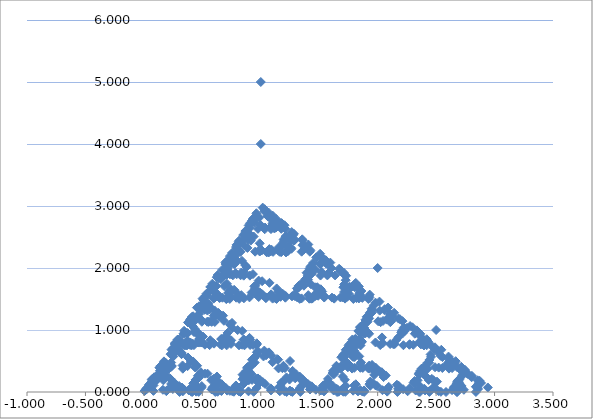
| Category | Series 0 |
|---|---|
| 1.0 | 5 |
| 1.0 | 4 |
| 2.0 | 2 |
| 2.5 | 1 |
| 1.25 | 0.5 |
| 0.625 | 0.25 |
| 1.8125 | 0.125 |
| 1.40625 | 1.562 |
| 0.703125 | 0.781 |
| 1.8515625 | 0.391 |
| 0.92578125 | 0.195 |
| 0.962890625 | 1.598 |
| 1.9814453125 | 0.799 |
| 2.49072265625 | 0.399 |
| 1.245361328125 | 0.2 |
| 0.6226806640625 | 0.1 |
| 1.81134033203125 | 0.05 |
| 2.405670166015625 | 0.025 |
| 1.2028350830078125 | 0.012 |
| 1.1014175415039062 | 1.506 |
| 1.0507087707519531 | 2.253 |
| 2.0253543853759766 | 1.127 |
| 1.5126771926879883 | 2.063 |
| 0.7563385963439941 | 1.032 |
| 0.8781692981719971 | 2.016 |
| 0.9390846490859985 | 2.508 |
| 0.46954232454299927 | 1.254 |
| 0.7347711622714996 | 2.127 |
| 0.8673855811357498 | 2.563 |
| 1.933692790567875 | 1.282 |
| 0.9668463952839375 | 0.641 |
| 1.9834231976419687 | 0.32 |
| 1.4917115988209844 | 1.66 |
| 1.2458557994104922 | 2.33 |
| 1.122927899705246 | 2.665 |
| 1.061463949852623 | 2.833 |
| 1.0307319749263115 | 2.916 |
| 2.0153659874631558 | 1.458 |
| 1.5076829937315779 | 2.229 |
| 0.7538414968657889 | 1.115 |
| 0.37692074843289447 | 0.557 |
| 0.18846037421644724 | 0.279 |
| 0.5942301871082236 | 1.639 |
| 1.7971150935541118 | 0.82 |
| 2.398557546777056 | 0.41 |
| 2.699278773388528 | 0.205 |
| 1.349639386694264 | 0.102 |
| 2.174819693347132 | 0.051 |
| 1.087409846673566 | 0.026 |
| 1.043704923336783 | 1.513 |
| 2.0218524616683915 | 0.756 |
| 1.5109262308341957 | 1.878 |
| 1.2554631154170979 | 2.439 |
| 2.127731557708549 | 1.22 |
| 1.5638657788542745 | 2.11 |
| 1.2819328894271371 | 2.555 |
| 2.140966444713569 | 1.277 |
| 1.0704832223567844 | 0.639 |
| 2.0352416111783924 | 0.319 |
| 1.0176208055891962 | 0.16 |
| 1.008810402794598 | 1.58 |
| 1.004405201397299 | 2.29 |
| 0.5022026006986495 | 1.145 |
| 0.25110130034932476 | 0.572 |
| 1.6255506501746624 | 0.286 |
| 2.312775325087331 | 0.143 |
| 2.6563876625436658 | 0.072 |
| 1.3281938312718329 | 0.036 |
| 0.6640969156359164 | 0.018 |
| 0.3320484578179582 | 0.009 |
| 1.666024228908979 | 0.004 |
| 1.3330121144544895 | 1.502 |
| 0.6665060572272448 | 0.751 |
| 0.3332530286136224 | 0.376 |
| 0.1666265143068112 | 0.188 |
| 1.5833132571534057 | 0.094 |
| 1.2916566285767028 | 1.547 |
| 2.1458283142883516 | 0.773 |
| 1.5729141571441758 | 1.887 |
| 1.286457078572088 | 2.443 |
| 0.643228539286044 | 1.222 |
| 0.321614269643022 | 0.611 |
| 0.160807134821511 | 0.305 |
| 0.5804035674107555 | 1.653 |
| 0.7902017837053777 | 2.326 |
| 1.8951008918526888 | 1.163 |
| 1.4475504459263444 | 2.082 |
| 2.223775222963172 | 1.041 |
| 2.611887611481586 | 0.52 |
| 2.8059438057407933 | 0.26 |
| 1.4029719028703966 | 0.13 |
| 0.7014859514351983 | 0.065 |
| 1.850742975717599 | 0.033 |
| 1.4253714878587995 | 1.516 |
| 1.2126857439293999 | 2.258 |
| 0.6063428719646999 | 1.129 |
| 1.80317143598235 | 0.565 |
| 0.901585717991175 | 0.282 |
| 1.9507928589955874 | 0.141 |
| 2.4753964294977937 | 0.071 |
| 2.737698214748897 | 0.035 |
| 1.8688491073744484 | 1.518 |
| 0.9344245536872242 | 0.759 |
| 1.967212276843612 | 0.379 |
| 1.483606138421806 | 1.69 |
| 1.241803069210903 | 2.345 |
| 1.1209015346054514 | 2.672 |
| 2.0604507673027257 | 1.336 |
| 1.0302253836513628 | 0.668 |
| 2.0151126918256814 | 0.334 |
| 2.5075563459128407 | 0.167 |
| 1.7537781729564204 | 1.584 |
| 0.8768890864782102 | 0.792 |
| 0.4384445432391051 | 0.396 |
| 1.7192222716195524 | 0.198 |
| 2.359611135809776 | 0.099 |
| 2.679805567904888 | 0.049 |
| 1.839902783952444 | 1.525 |
| 1.4199513919762219 | 2.262 |
| 1.209975695988111 | 2.631 |
| 0.6049878479940555 | 1.316 |
| 1.8024939239970277 | 0.658 |
| 0.9012469619985138 | 0.329 |
| 0.9506234809992569 | 1.664 |
| 0.47531174049962843 | 0.832 |
| 0.23765587024981422 | 0.416 |
| 0.11882793512490711 | 0.208 |
| 0.059413967562453554 | 0.104 |
| 0.5297069837812268 | 1.552 |
| 1.7648534918906134 | 0.776 |
| 0.8824267459453067 | 0.388 |
| 0.44121337297265334 | 0.194 |
| 0.7206066864863266 | 1.597 |
| 1.8603033432431633 | 0.799 |
| 1.4301516716215816 | 1.899 |
| 2.215075835810791 | 0.95 |
| 2.6075379179053955 | 0.475 |
| 2.8037689589526975 | 0.237 |
| 1.4018844794763488 | 0.119 |
| 1.2009422397381744 | 1.559 |
| 0.6004711198690872 | 0.78 |
| 1.8002355599345436 | 0.39 |
| 0.9001177799672718 | 0.195 |
| 0.4500588899836359 | 0.097 |
| 0.725029444991818 | 1.549 |
| 0.362514722495909 | 0.774 |
| 0.1812573612479545 | 0.387 |
| 0.5906286806239772 | 1.694 |
| 0.2953143403119886 | 0.847 |
| 1.6476571701559943 | 0.423 |
| 1.3238285850779972 | 1.712 |
| 0.6619142925389986 | 0.856 |
| 0.3309571462694993 | 0.428 |
| 0.16547857313474965 | 0.214 |
| 0.08273928656737482 | 0.107 |
| 0.5413696432836874 | 1.553 |
| 0.2706848216418437 | 0.777 |
| 0.13534241082092185 | 0.388 |
| 0.5676712054104609 | 1.694 |
| 1.7838356027052304 | 0.847 |
| 1.3919178013526152 | 1.924 |
| 1.1959589006763076 | 2.462 |
| 0.5979794503381538 | 1.231 |
| 0.798989725169077 | 2.115 |
| 0.8994948625845385 | 2.558 |
| 1.9497474312922694 | 1.279 |
| 0.9748737156461347 | 0.639 |
| 0.48743685782306734 | 0.32 |
| 0.7437184289115337 | 1.66 |
| 0.37185921445576686 | 0.83 |
| 1.6859296072278833 | 0.415 |
| 0.8429648036139417 | 0.207 |
| 0.9214824018069708 | 1.604 |
| 0.4607412009034854 | 0.802 |
| 0.2303706004517427 | 0.401 |
| 0.6151853002258714 | 1.7 |
| 1.8075926501129356 | 0.85 |
| 1.4037963250564678 | 1.925 |
| 2.201898162528234 | 0.963 |
| 1.100949081264117 | 0.481 |
| 2.0504745406320586 | 0.241 |
| 1.5252372703160293 | 1.62 |
| 1.2626186351580146 | 2.31 |
| 1.1313093175790074 | 2.655 |
| 1.0656546587895037 | 2.828 |
| 0.5328273293947519 | 1.414 |
| 0.7664136646973759 | 2.207 |
| 1.883206832348688 | 1.103 |
| 0.941603416174344 | 0.552 |
| 1.970801708087172 | 0.276 |
| 0.985400854043586 | 0.138 |
| 0.492700427021793 | 0.069 |
| 0.7463502135108965 | 1.534 |
| 0.37317510675544824 | 0.767 |
| 0.6865875533777241 | 1.884 |
| 0.8432937766888621 | 2.442 |
| 0.42164688834443104 | 1.221 |
| 1.7108234441722154 | 0.61 |
| 2.3554117220861075 | 0.305 |
| 1.1777058610430537 | 0.153 |
| 0.5888529305215269 | 0.076 |
| 0.29442646526076344 | 0.038 |
| 0.6472132326303817 | 1.519 |
| 1.8236066163151907 | 0.76 |
| 2.4118033081575954 | 0.38 |
| 1.7059016540787977 | 1.69 |
| 0.8529508270393988 | 0.845 |
| 1.9264754135196993 | 0.422 |
| 2.4632377067598497 | 0.211 |
| 1.7316188533799248 | 1.606 |
| 0.8658094266899624 | 0.803 |
| 0.9329047133449813 | 1.901 |
| 0.46645235667249063 | 0.951 |
| 0.23322617833624532 | 0.475 |
| 0.11661308916812266 | 0.238 |
| 0.5583065445840614 | 1.619 |
| 1.7791532722920307 | 0.809 |
| 0.8895766361460153 | 0.405 |
| 0.9447883180730077 | 1.702 |
| 0.47239415903650384 | 0.851 |
| 0.23619707951825192 | 0.426 |
| 0.618098539759126 | 1.713 |
| 1.809049269879563 | 0.856 |
| 0.9045246349397815 | 0.428 |
| 0.9522623174698908 | 1.714 |
| 0.4761311587349454 | 0.857 |
| 1.7380655793674726 | 0.429 |
| 1.3690327896837364 | 1.714 |
| 1.1845163948418682 | 2.357 |
| 1.092258197420934 | 2.679 |
| 0.546129098710467 | 1.339 |
| 0.2730645493552335 | 0.67 |
| 0.6365322746776167 | 1.835 |
| 0.8182661373388084 | 2.417 |
| 0.4091330686694042 | 1.209 |
| 0.7045665343347021 | 2.104 |
| 1.852283267167351 | 1.052 |
| 1.4261416335836756 | 2.026 |
| 1.2130708167918378 | 2.513 |
| 2.106535408395919 | 1.257 |
| 1.0532677041979595 | 0.628 |
| 2.0266338520989797 | 0.314 |
| 1.5133169260494899 | 1.657 |
| 1.256658463024745 | 2.329 |
| 1.1283292315123725 | 2.664 |
| 0.5641646157561863 | 1.332 |
| 0.28208230787809313 | 0.666 |
| 1.6410411539390466 | 0.333 |
| 2.3205205769695234 | 0.167 |
| 1.1602602884847617 | 0.083 |
| 0.5801301442423809 | 0.042 |
| 0.7900650721211904 | 1.521 |
| 0.3950325360605952 | 0.76 |
| 0.1975162680302976 | 0.38 |
| 0.0987581340151488 | 0.19 |
| 0.0493790670075744 | 0.095 |
| 0.0246895335037872 | 0.048 |
| 1.5123447667518937 | 0.024 |
| 2.256172383375947 | 0.012 |
| 1.6280861916879734 | 1.506 |
| 0.8140430958439867 | 0.753 |
| 0.9070215479219934 | 1.876 |
| 0.4535107739609967 | 0.938 |
| 1.7267553869804984 | 0.469 |
| 1.363377693490249 | 1.735 |
| 1.1816888467451245 | 2.367 |
| 2.0908444233725625 | 1.184 |
| 1.0454222116862812 | 0.592 |
| 0.5227111058431406 | 0.296 |
| 0.2613555529215703 | 0.148 |
| 0.6306777764607852 | 1.574 |
| 0.3153388882303926 | 0.787 |
| 1.6576694441151962 | 0.393 |
| 1.3288347220575982 | 1.697 |
| 0.6644173610287991 | 0.848 |
| 0.8322086805143996 | 1.924 |
| 1.9161043402571998 | 0.962 |
| 1.4580521701286 | 1.981 |
| 1.2290260850643 | 2.491 |
| 0.61451304253215 | 1.245 |
| 1.807256521266075 | 0.623 |
| 1.4036282606330375 | 1.811 |
| 0.7018141303165187 | 0.906 |
| 1.8509070651582593 | 0.453 |
| 2.4254535325791298 | 0.226 |
| 1.7127267662895649 | 1.613 |
| 2.3563633831447826 | 0.807 |
| 2.6781816915723913 | 0.403 |
| 1.8390908457861956 | 1.702 |
| 2.4195454228930977 | 0.851 |
| 1.7097727114465489 | 1.925 |
| 1.3548863557232744 | 2.463 |
| 0.6774431778616372 | 1.231 |
| 0.8387215889308186 | 2.116 |
| 0.4193607944654093 | 1.058 |
| 1.7096803972327046 | 0.529 |
| 1.3548401986163523 | 1.764 |
| 2.177420099308176 | 0.882 |
| 2.588710049654088 | 0.441 |
| 1.294355024827044 | 0.221 |
| 1.147177512413522 | 1.61 |
| 1.073588756206761 | 2.305 |
| 1.0367943781033806 | 2.653 |
| 0.5183971890516903 | 1.326 |
| 1.759198594525845 | 0.663 |
| 2.3795992972629225 | 0.332 |
| 1.1897996486314613 | 0.166 |
| 2.0948998243157306 | 0.083 |
| 1.5474499121578653 | 1.541 |
| 2.2737249560789325 | 0.771 |
| 2.6368624780394665 | 0.385 |
| 1.8184312390197332 | 1.693 |
| 0.9092156195098666 | 0.846 |
| 0.4546078097549333 | 0.423 |
| 0.22730390487746666 | 0.212 |
| 0.6136519524387334 | 1.606 |
| 1.8068259762193666 | 0.803 |
| 0.9034129881096833 | 0.401 |
| 0.45170649405484165 | 0.201 |
| 1.7258532470274208 | 0.1 |
| 2.3629266235137103 | 0.05 |
| 1.6814633117568552 | 1.525 |
| 0.8407316558784276 | 0.763 |
| 1.9203658279392137 | 0.381 |
| 0.9601829139696069 | 0.191 |
| 0.9800914569848034 | 1.595 |
| 0.4900457284924017 | 0.798 |
| 1.745022864246201 | 0.399 |
| 0.8725114321231004 | 0.199 |
| 1.9362557160615501 | 0.1 |
| 1.468127858030775 | 1.55 |
| 1.2340639290153876 | 2.275 |
| 1.1170319645076938 | 2.637 |
| 2.058515982253847 | 1.319 |
| 1.5292579911269235 | 2.159 |
| 1.2646289955634618 | 2.58 |
| 1.132314497781731 | 2.79 |
| 1.0661572488908655 | 2.895 |
| 1.0330786244454329 | 2.947 |
| 1.0165393122227164 | 2.974 |
| 0.5082696561113582 | 1.487 |
| 0.7541348280556791 | 2.243 |
| 0.37706741402783955 | 1.122 |
| 1.6885337070139197 | 0.561 |
| 0.8442668535069598 | 0.28 |
| 0.4221334267534799 | 0.14 |
| 1.7110667133767399 | 0.07 |
| 2.35553335668837 | 0.035 |
| 2.677766678344185 | 0.018 |
| 1.8388833391720925 | 1.509 |
| 2.419441669586046 | 0.754 |
| 2.709720834793023 | 0.377 |
| 2.8548604173965115 | 0.189 |
| 1.4274302086982558 | 0.094 |
| 1.2137151043491279 | 1.547 |
| 2.106857552174564 | 0.774 |
| 2.553428776087282 | 0.387 |
| 1.776714388043641 | 1.693 |
| 2.3883571940218205 | 0.847 |
| 1.1941785970109102 | 0.423 |
| 0.5970892985054551 | 0.212 |
| 1.7985446492527275 | 0.106 |
| 2.399272324626364 | 0.053 |
| 1.699636162313182 | 1.526 |
| 1.349818081156591 | 2.263 |
| 1.1749090405782954 | 2.632 |
| 1.0874545202891477 | 2.816 |
| 0.5437272601445738 | 1.408 |
| 0.2718636300722869 | 0.704 |
| 1.6359318150361435 | 0.352 |
| 1.3179659075180719 | 1.676 |
| 2.158982953759036 | 0.838 |
| 1.579491476879518 | 1.919 |
| 1.289745738439759 | 2.459 |
| 0.6448728692198795 | 1.23 |
| 0.32243643460993976 | 0.615 |
| 0.16121821730496988 | 0.307 |
| 1.580609108652485 | 0.154 |
| 0.7903045543262425 | 0.077 |
| 0.39515227716312123 | 0.038 |
| 1.6975761385815606 | 0.019 |
| 1.3487880692907803 | 1.51 |
| 1.17439403464539 | 2.255 |
| 1.087197017322695 | 2.627 |
| 0.5435985086613475 | 1.314 |
| 1.7717992543306738 | 0.657 |
| 1.3858996271653368 | 1.828 |
| 1.1929498135826684 | 2.414 |
| 2.096474906791334 | 1.207 |
| 1.548237453395667 | 2.104 |
| 1.2741187266978335 | 2.552 |
| 0.6370593633489168 | 1.276 |
| 0.3185296816744584 | 0.638 |
| 0.6592648408372292 | 1.819 |
| 0.8296324204186146 | 2.409 |
| 0.4148162102093073 | 1.205 |
| 1.7074081051046537 | 0.602 |
| 2.353704052552327 | 0.301 |
| 1.1768520262761635 | 0.151 |
| 1.0884260131380818 | 1.575 |
| 2.044213006569041 | 0.788 |
| 2.5221065032845207 | 0.394 |
| 1.7610532516422603 | 1.697 |
| 1.3805266258211302 | 2.348 |
| 2.190263312910565 | 1.174 |
| 1.5951316564552824 | 2.087 |
| 2.297565828227641 | 1.044 |
| 1.1487829141138206 | 0.522 |
| 1.0743914570569104 | 1.761 |
| 2.037195728528455 | 0.88 |
| 1.5185978642642275 | 1.94 |
| 1.2592989321321137 | 2.47 |
| 1.129649466066057 | 2.735 |
| 0.5648247330330285 | 1.368 |
| 0.28241236651651425 | 0.684 |
| 0.14120618325825712 | 0.342 |
| 0.07060309162912856 | 0.171 |
| 0.5353015458145642 | 1.585 |
| 0.2676507729072821 | 0.793 |
| 0.13382538645364106 | 0.396 |
| 0.06691269322682053 | 0.198 |
| 1.5334563466134103 | 0.099 |
| 0.7667281733067052 | 0.05 |
| 1.8833640866533525 | 0.025 |
| 2.441682043326676 | 0.012 |
| 1.720841021663338 | 1.506 |
| 0.860420510831669 | 0.753 |
| 1.9302102554158345 | 0.377 |
| 1.4651051277079172 | 1.688 |
| 1.2325525638539587 | 2.344 |
| 1.1162762819269794 | 2.672 |
| 1.0581381409634898 | 2.836 |
| 0.5290690704817449 | 1.418 |
| 0.26453453524087245 | 0.709 |
| 1.6322672676204362 | 0.355 |
| 2.3161336338102183 | 0.177 |
| 2.658066816905109 | 0.089 |
| 1.8290334084525546 | 1.544 |
| 2.414516704226277 | 0.772 |
| 1.2072583521131386 | 0.386 |
| 0.6036291760565693 | 0.193 |
| 0.30181458802828465 | 0.097 |
| 1.6509072940141423 | 0.048 |
| 2.325453647007071 | 0.024 |
| 1.1627268235035355 | 0.012 |
| 2.081363411751768 | 0.006 |
| 2.540681705875884 | 0.003 |
| 1.270340852937942 | 0.002 |
| 1.135170426468971 | 1.501 |
| 1.0675852132344854 | 2.25 |
| 1.0337926066172427 | 2.625 |
| 2.0168963033086214 | 1.313 |
| 2.508448151654311 | 0.656 |
| 2.7542240758271554 | 0.328 |
| 1.3771120379135777 | 0.164 |
| 0.6885560189567889 | 0.082 |
| 0.34427800947839443 | 0.041 |
| 0.6721390047391972 | 1.521 |
| 0.3360695023695986 | 0.76 |
| 0.1680347511847993 | 0.38 |
| 0.5840173755923996 | 1.69 |
| 0.7920086877961998 | 2.345 |
| 0.3960043438980999 | 1.173 |
| 0.6980021719490499 | 2.086 |
| 1.849001085974525 | 1.043 |
| 0.9245005429872625 | 0.522 |
| 0.46225027149363124 | 0.261 |
| 0.7311251357468156 | 1.63 |
| 1.8655625678734078 | 0.815 |
| 1.4327812839367038 | 1.908 |
| 0.7163906419683519 | 0.954 |
| 1.858195320984176 | 0.477 |
| 1.429097660492088 | 1.738 |
| 0.714548830246044 | 0.869 |
| 0.857274415123022 | 1.935 |
| 0.428637207561511 | 0.967 |
| 0.7143186037807555 | 1.984 |
| 1.8571593018903778 | 0.992 |
| 1.428579650945189 | 1.996 |
| 1.2142898254725945 | 2.498 |
| 1.1071449127362971 | 2.749 |
| 0.5535724563681486 | 1.374 |
| 0.7767862281840743 | 2.187 |
| 1.8883931140920371 | 1.094 |
| 0.9441965570460186 | 0.547 |
| 0.4720982785230093 | 0.273 |
| 0.23604913926150464 | 0.137 |
| 0.6180245696307524 | 1.568 |
| 0.8090122848153762 | 2.284 |
| 0.9045061424076881 | 2.642 |
| 1.952253071203844 | 1.321 |
| 0.976126535601922 | 0.661 |
| 1.9880632678009609 | 0.33 |
| 1.4940316339004804 | 1.665 |
| 0.7470158169502402 | 0.833 |
| 0.3735079084751201 | 0.416 |
| 0.68675395423756 | 1.708 |
| 1.84337697711878 | 0.854 |
| 0.92168848855939 | 0.427 |
| 0.460844244279695 | 0.214 |
| 0.7304221221398475 | 1.607 |
| 0.36521106106992374 | 0.803 |
| 0.18260553053496187 | 0.402 |
| 0.09130276526748093 | 0.201 |
| 0.04565138263374047 | 0.1 |
| 0.022825691316870234 | 0.05 |
| 1.511412845658435 | 0.025 |
| 0.7557064228292175 | 0.013 |
| 1.8778532114146087 | 0.006 |
| 0.9389266057073044 | 0.003 |
| 0.4694633028536522 | 0.002 |
| 0.7347316514268261 | 1.501 |
| 0.36736582571341303 | 0.75 |
| 1.6836829128567066 | 0.375 |
| 2.3418414564283534 | 0.188 |
| 1.1709207282141767 | 0.094 |
| 2.0854603641070883 | 0.047 |
| 1.5427301820535442 | 1.523 |
| 2.271365091026772 | 0.762 |
| 1.635682545513386 | 1.881 |
| 2.3178412727566933 | 0.94 |
| 2.6589206363783466 | 0.47 |
| 1.3294603181891733 | 0.235 |
| 2.164730159094587 | 0.118 |
| 1.0823650795472934 | 0.059 |
| 2.0411825397736467 | 0.029 |
| 2.5205912698868236 | 0.015 |
| 1.2602956349434118 | 0.007 |
| 0.6301478174717059 | 0.004 |
| 0.815073908735853 | 1.502 |
| 0.4075369543679265 | 0.751 |
| 0.20376847718396324 | 0.375 |
| 0.6018842385919816 | 1.688 |
| 0.3009421192959908 | 0.844 |
| 0.1504710596479954 | 0.422 |
| 1.5752355298239977 | 0.211 |
| 0.7876177649119989 | 0.105 |
| 0.39380888245599943 | 0.053 |
| 0.19690444122799972 | 0.026 |
| 0.5984522206139998 | 1.513 |
| 0.2992261103069999 | 0.757 |
| 0.14961305515349996 | 0.378 |
| 0.57480652757675 | 1.689 |
| 0.287403263788375 | 0.845 |
| 0.1437016318941875 | 0.422 |
| 0.07185081594709375 | 0.211 |
| 1.535925407973547 | 0.106 |
| 0.7679627039867735 | 0.053 |
| 0.38398135199338673 | 0.026 |
| 0.19199067599669337 | 0.013 |
| 0.5959953379983467 | 1.507 |
| 0.7979976689991733 | 2.253 |
| 0.3989988344995867 | 1.127 |
| 0.6994994172497934 | 2.063 |
| 0.8497497086248966 | 2.532 |
| 0.9248748543124483 | 2.766 |
| 0.9624374271562242 | 2.883 |
| 1.981218713578112 | 1.441 |
| 2.490609356789056 | 0.721 |
| 2.745304678394528 | 0.36 |
| 2.872652339197264 | 0.18 |
| 1.436326169598632 | 0.09 |
| 2.218163084799316 | 0.045 |
| 1.609081542399658 | 1.523 |
| 2.304540771199829 | 0.761 |
| 1.1522703855999146 | 0.381 |
| 0.5761351927999573 | 0.19 |
| 0.28806759639997864 | 0.095 |
| 1.6440337981999893 | 0.048 |
| 1.3220168990999945 | 1.524 |
| 1.1610084495499973 | 2.262 |
| 0.5805042247749986 | 1.131 |
| 1.7902521123874993 | 0.565 |
| 2.3951260561937495 | 0.283 |
| 2.6975630280968748 | 0.141 |
| 1.8487815140484374 | 1.571 |
| 1.4243907570242187 | 2.285 |
| 2.212195378512109 | 1.143 |
| 2.6060976892560546 | 0.571 |
| 1.3030488446280273 | 0.286 |
| 0.6515244223140136 | 0.143 |
| 0.3257622111570068 | 0.071 |
| 0.1628811055785034 | 0.036 |
| 0.0814405527892517 | 0.018 |
| 1.540720276394626 | 0.009 |
| 0.770360138197313 | 0.004 |
| 1.8851800690986564 | 0.002 |
| 2.4425900345493283 | 0.001 |
| 1.2212950172746642 | 0.001 |
| 0.6106475086373321 | 0 |
| 0.30532375431866604 | 0 |
| 1.652661877159333 | 0 |
| 0.8263309385796666 | 0 |
| 0.4131654692898333 | 0 |
| 0.7065827346449166 | 1.5 |
| 1.8532913673224582 | 0.75 |
| 2.426645683661229 | 0.375 |
| 1.7133228418306146 | 1.688 |
| 0.8566614209153073 | 0.844 |
| 1.9283307104576537 | 0.422 |
| 0.9641653552288268 | 0.211 |
| 1.9820826776144134 | 0.105 |
| 1.4910413388072068 | 1.553 |
| 0.7455206694036034 | 0.776 |
| 1.8727603347018018 | 0.388 |
| 2.436380167350901 | 0.194 |
| 2.7181900836754505 | 0.097 |
| 2.8590950418377252 | 0.049 |
| 1.9295475209188626 | 1.524 |
| 0.9647737604594313 | 0.762 |
| 1.9823868802297158 | 0.381 |
| 0.9911934401148579 | 0.191 |
| 1.995596720057429 | 0.095 |
| 2.4977983600287144 | 0.048 |
| 1.2488991800143572 | 0.024 |
| 1.1244495900071785 | 1.512 |
| 0.5622247950035892 | 0.756 |
| 1.7811123975017946 | 0.378 |
| 0.8905561987508973 | 0.189 |
| 0.9452780993754486 | 1.594 |
| 0.4726390496877243 | 0.797 |
| 0.7363195248438621 | 1.899 |
| 0.36815976242193105 | 0.949 |
| 0.18407988121096552 | 0.475 |
| 0.09203994060548276 | 0.237 |
| 1.5460199703027413 | 0.119 |
| 2.2730099851513708 | 0.059 |
| 2.636504992575685 | 0.03 |
| 1.8182524962878426 | 1.515 |
| 0.9091262481439213 | 0.757 |
| 1.9545631240719605 | 0.379 |
| 2.47728156203598 | 0.189 |
| 1.73864078101799 | 1.595 |
| 1.369320390508995 | 2.297 |
| 0.6846601952544975 | 1.149 |
| 1.8423300976272488 | 0.574 |
| 0.9211650488136244 | 0.287 |
| 1.9605825244068122 | 0.144 |
| 2.480291262203406 | 0.072 |
| 1.740145631101703 | 1.536 |
| 2.3700728155508513 | 0.768 |
| 1.1850364077754256 | 0.384 |
| 0.5925182038877128 | 0.192 |
| 0.7962591019438564 | 1.596 |
| 0.3981295509719282 | 0.798 |
| 0.6990647754859641 | 1.899 |
| 0.34953238774298206 | 0.949 |
| 0.17476619387149103 | 0.475 |
| 0.08738309693574552 | 0.237 |
| 0.04369154846787276 | 0.119 |
| 0.02184577423393638 | 0.059 |
| 0.01092288711696819 | 0.03 |
| 0.005461443558484095 | 0.015 |
| 0.502730721779242 | 1.507 |
| 1.7513653608896211 | 0.754 |
| 2.3756826804448106 | 0.377 |
| 2.6878413402224055 | 0.188 |
| 1.8439206701112028 | 1.594 |
| 2.4219603350556014 | 0.797 |
| 1.7109801675278007 | 1.899 |
| 1.3554900837639003 | 2.449 |
| 1.1777450418819502 | 2.725 |
| 2.088872520940975 | 1.362 |
| 2.5444362604704875 | 0.681 |
| 1.2722181302352438 | 0.341 |
| 1.1361090651176218 | 1.67 |
| 0.5680545325588109 | 0.835 |
| 0.7840272662794054 | 1.918 |
| 0.8920136331397027 | 2.459 |
| 0.9460068165698514 | 2.729 |
| 0.4730034082849257 | 1.365 |
| 0.23650170414246285 | 0.682 |
| 1.6182508520712315 | 0.341 |
| 1.3091254260356158 | 1.671 |
| 1.1545627130178078 | 2.335 |
| 2.077281356508904 | 1.168 |
| 2.5386406782544517 | 0.584 |
| 2.769320339127226 | 0.292 |
| 2.884660169563613 | 0.146 |
| 2.9423300847818066 | 0.073 |
| 1.4711650423909033 | 0.036 |
| 0.7355825211954516 | 0.018 |
| 1.8677912605977258 | 0.009 |
| 1.433895630298863 | 1.505 |
| 1.2169478151494315 | 2.252 |
| 2.108473907574716 | 1.126 |
| 2.554236953787358 | 0.563 |
| 1.277118476893679 | 0.282 |
| 0.6385592384468395 | 0.141 |
| 0.31927961922341974 | 0.07 |
| 1.65963980961171 | 0.035 |
| 0.829819904805855 | 0.018 |
| 0.4149099524029275 | 0.009 |
| 1.7074549762014637 | 0.004 |
| 2.353727488100732 | 0.002 |
| 2.676863744050366 | 0.001 |
| 1.338431872025183 | 0.001 |
| 2.1692159360125913 | 0 |
| 2.5846079680062957 | 0 |
| 1.7923039840031478 | 1.5 |
| 2.396151992001574 | 0.75 |
| 2.698075996000787 | 0.375 |
| 1.3490379980003935 | 0.188 |
| 1.1745189990001967 | 1.594 |
| 0.5872594995000984 | 0.797 |
| 0.7936297497500492 | 1.898 |
| 1.8968148748750246 | 0.949 |
| 0.9484074374375123 | 0.475 |
| 0.47420371871875616 | 0.237 |
| 0.23710185935937808 | 0.119 |
| 1.618550929679689 | 0.059 |
| 1.3092754648398444 | 1.53 |
| 0.6546377324199222 | 0.765 |
| 0.8273188662099611 | 1.882 |
| 0.9136594331049805 | 2.441 |
| 0.4568297165524903 | 1.221 |
| 0.22841485827624514 | 0.61 |
| 1.6142074291381225 | 0.305 |
| 2.3071037145690614 | 0.153 |
| 2.6535518572845307 | 0.076 |
| 1.3267759286422653 | 0.038 |
| 0.6633879643211327 | 0.019 |
| 1.8316939821605662 | 0.01 |
| 1.4158469910802831 | 1.505 |
| 0.7079234955401416 | 0.752 |
| 0.8539617477700707 | 1.876 |
| 1.9269808738850354 | 0.938 |
| 1.4634904369425177 | 1.969 |
| 2.231745218471259 | 0.985 |
| 2.6158726092356295 | 0.492 |
| 1.8079363046178147 | 1.746 |
| 0.9039681523089074 | 0.873 |
| 1.9519840761544538 | 0.437 |
| 0.9759920380772269 | 0.218 |
| 0.9879960190386134 | 1.609 |
| 0.9939980095193067 | 2.305 |
| 0.49699900475965336 | 1.152 |
| 0.24849950237982668 | 0.576 |
| 0.12424975118991334 | 0.288 |
| 0.06212487559495667 | 0.144 |
| 1.5310624377974784 | 0.072 |
| 0.7655312188987392 | 0.036 |
| 1.8827656094493697 | 0.018 |
| 1.4413828047246848 | 1.509 |
| 2.2206914023623425 | 0.755 |
| 2.6103457011811715 | 0.377 |
| 1.8051728505905857 | 1.689 |
| 0.9025864252952929 | 0.844 |
| 0.45129321264764644 | 0.422 |
| 0.22564660632382322 | 0.211 |
| 1.6128233031619117 | 0.106 |
| 0.8064116515809558 | 0.053 |
| 0.9032058257904779 | 1.526 |
| 0.951602912895239 | 2.263 |
| 0.9758014564476195 | 2.632 |
| 0.9879007282238097 | 2.816 |
| 0.49395036411190485 | 1.408 |
| 0.24697518205595242 | 0.704 |
| 0.6234875910279762 | 1.852 |
| 0.8117437955139881 | 2.426 |
| 1.905871897756994 | 1.213 |
| 2.4529359488784968 | 0.606 |
| 1.7264679744392484 | 1.803 |
| 2.3632339872196244 | 0.902 |
| 1.6816169936098122 | 1.951 |
| 2.340808496804906 | 0.975 |
| 1.670404248402453 | 1.988 |
| 2.3352021242012264 | 0.994 |
| 2.667601062100613 | 0.497 |
| 1.3338005310503065 | 0.248 |
| 0.6669002655251532 | 0.124 |
| 0.8334501327625766 | 1.562 |
| 0.4167250663812883 | 0.781 |
| 0.7083625331906441 | 1.891 |
| 1.8541812665953221 | 0.945 |
| 2.427090633297661 | 0.473 |
| 1.7135453166488306 | 1.736 |
| 1.3567726583244153 | 2.368 |
| 2.1783863291622074 | 1.184 |
| 1.0891931645811037 | 0.592 |
| 0.5445965822905519 | 0.296 |
| 0.7722982911452759 | 1.648 |
| 0.886149145572638 | 2.324 |
| 0.443074572786319 | 1.162 |
| 1.7215372863931595 | 0.581 |
| 2.3607686431965798 | 0.291 |
| 1.1803843215982899 | 0.145 |
| 0.5901921607991449 | 0.073 |
| 0.29509608039957247 | 0.036 |
| 0.6475480401997862 | 1.518 |
| 0.8237740200998931 | 2.259 |
| 0.41188701004994654 | 1.13 |
| 1.7059435050249734 | 0.565 |
| 2.3529717525124867 | 0.282 |
| 2.676485876256243 | 0.141 |
| 1.3382429381281216 | 0.071 |
| 1.1691214690640608 | 1.535 |
| 1.0845607345320305 | 2.268 |
| 0.5422803672660153 | 1.134 |
| 0.7711401836330076 | 2.067 |
| 1.8855700918165037 | 1.033 |
| 2.442785045908252 | 0.517 |
| 2.721392522954126 | 0.258 |
| 1.860696261477063 | 1.629 |
| 2.4303481307385315 | 0.815 |
| 2.7151740653692658 | 0.407 |
| 1.3575870326846329 | 0.204 |
| 2.178793516342316 | 0.102 |
| 1.089396758171158 | 0.051 |
| 1.044698379085579 | 1.525 |
| 0.5223491895427895 | 0.763 |
| 0.7611745947713948 | 1.881 |
| 1.8805872973856974 | 0.941 |
| 2.440293648692849 | 0.47 |
| 1.2201468243464244 | 0.235 |
| 0.6100734121732122 | 0.118 |
| 0.3050367060866061 | 0.059 |
| 0.6525183530433031 | 1.529 |
| 0.8262591765216516 | 2.265 |
| 1.913129588260826 | 1.132 |
| 2.456564794130413 | 0.566 |
| 2.7282823970652066 | 0.283 |
| 2.8641411985326033 | 0.142 |
| 1.9320705992663016 | 1.571 |
| 0.9660352996331508 | 0.785 |
| 1.9830176498165755 | 0.393 |
| 0.9915088249082877 | 0.196 |
| 0.9957544124541439 | 1.598 |
| 0.49787720622707193 | 0.799 |
| 0.748938603113536 | 1.9 |
| 0.374469301556768 | 0.95 |
| 0.687234650778384 | 1.975 |
| 0.343617325389192 | 0.987 |
| 0.171808662694596 | 0.494 |
| 0.585904331347298 | 1.747 |
| 0.792952165673649 | 2.373 |
| 0.8964760828368246 | 2.687 |
| 1.9482380414184122 | 1.343 |
| 1.474119020709206 | 2.172 |
| 0.737059510354603 | 1.086 |
| 0.8685297551773015 | 2.043 |
| 0.43426487758865073 | 1.021 |
| 1.7171324387943254 | 0.511 |
| 0.8585662193971627 | 0.255 |
| 1.9292831096985814 | 0.128 |
| 0.9646415548492907 | 0.064 |
| 0.9823207774246454 | 1.532 |
| 0.9911603887123227 | 2.266 |
| 0.49558019435616135 | 1.133 |
| 0.7477900971780806 | 2.066 |
| 1.8738950485890404 | 1.033 |
| 1.4369475242945202 | 2.017 |
| 1.21847376214726 | 2.508 |
| 2.10923688107363 | 1.254 |
| 1.554618440536815 | 2.127 |
| 2.2773092202684078 | 1.064 |
| 1.1386546101342039 | 0.532 |
| 2.0693273050671017 | 0.266 |
| 1.0346636525335509 | 0.133 |
| 1.0173318262667754 | 1.566 |
| 1.0086659131333877 | 2.283 |
| 2.004332956566694 | 1.142 |
| 1.502166478283347 | 2.071 |
| 2.2510832391416735 | 1.035 |
| 2.6255416195708365 | 0.518 |
| 1.8127708097854183 | 1.759 |
| 1.4063854048927091 | 2.379 |
| 1.2031927024463545 | 2.69 |
| 1.1015963512231772 | 2.845 |
| 0.5507981756115886 | 1.422 |
| 1.7753990878057944 | 0.711 |
| 2.3876995439028974 | 0.356 |
| 2.6938497719514487 | 0.178 |
| 2.8469248859757244 | 0.089 |
| 1.4234624429878622 | 0.044 |
| 0.7117312214939311 | 0.022 |
| 0.8558656107469655 | 1.511 |
| 0.42793280537348277 | 0.756 |
| 0.21396640268674139 | 0.378 |
| 0.10698320134337069 | 0.189 |
| 0.053491600671685346 | 0.094 |
| 0.5267458003358427 | 1.547 |
| 0.26337290016792136 | 0.774 |
| 0.6316864500839607 | 1.887 |
| 0.8158432250419804 | 2.443 |
| 0.9079216125209901 | 2.722 |
| 0.45396080626049506 | 1.361 |
| 1.7269804031302476 | 0.68 |
| 2.363490201565124 | 0.34 |
| 2.681745100782562 | 0.17 |
| 2.840872550391281 | 0.085 |
| 1.4204362751956405 | 0.043 |
| 1.2102181375978203 | 1.521 |
| 1.1051090687989102 | 2.261 |
| 0.5525545343994551 | 1.13 |
| 0.7762772671997276 | 2.065 |
| 0.8881386335998638 | 2.533 |
| 0.9440693167999319 | 2.766 |
| 0.47203465839996595 | 1.383 |
| 0.736017329199983 | 2.192 |
| 0.8680086645999915 | 2.596 |
| 0.9340043322999958 | 2.798 |
| 1.967002166149998 | 1.399 |
| 2.483501083074999 | 0.699 |
| 2.7417505415374994 | 0.35 |
| 1.3708752707687497 | 0.175 |
| 1.1854376353843747 | 1.587 |
| 1.0927188176921874 | 2.294 |
| 2.0463594088460937 | 1.147 |
| 1.0231797044230468 | 0.573 |
| 1.0115898522115234 | 1.787 |
| 0.5057949261057617 | 0.893 |
| 1.7528974630528809 | 0.447 |
| 0.8764487315264404 | 0.223 |
| 0.4382243657632202 | 0.112 |
| 0.2191121828816101 | 0.056 |
| 0.609556091440805 | 1.528 |
| 1.8047780457204026 | 0.764 |
| 1.4023890228602012 | 1.882 |
| 1.2011945114301006 | 2.441 |
| 1.1005972557150503 | 2.72 |
| 0.5502986278575251 | 1.36 |
| 0.2751493139287626 | 0.68 |
| 0.1375746569643813 | 0.34 |
| 0.06878732848219064 | 0.17 |
| 1.5343936642410954 | 0.085 |
| 1.2671968321205478 | 1.543 |
| 2.133598416060274 | 0.771 |
| 1.566799208030137 | 1.886 |
| 1.2833996040150684 | 2.443 |
| 1.1416998020075342 | 2.721 |
| 0.5708499010037671 | 1.361 |
| 0.28542495050188355 | 0.68 |
| 1.6427124752509417 | 0.34 |
| 2.321356237625471 | 0.17 |
| 1.1606781188127355 | 0.085 |
| 0.5803390594063678 | 0.043 |
| 1.7901695297031839 | 0.021 |
| 0.8950847648515919 | 0.011 |
| 0.44754238242579597 | 0.005 |
| 1.723771191212898 | 0.003 |
| 2.361885595606449 | 0.001 |
| 2.6809427978032243 | 0.001 |
| 2.840471398901612 | 0 |
| 1.920235699450806 | 1.5 |
| 2.4601178497254033 | 0.75 |
| 1.7300589248627016 | 1.875 |
| 2.365029462431351 | 0.938 |
| 1.6825147312156754 | 1.969 |
| 0.8412573656078377 | 0.984 |
| 0.42062868280391885 | 0.492 |
| 0.7103143414019595 | 1.746 |
| 0.8551571707009797 | 2.373 |
| 1.9275785853504899 | 1.187 |
| 0.9637892926752449 | 0.593 |
| 0.9818946463376225 | 1.797 |
| 0.9909473231688113 | 2.398 |
| 0.9954736615844056 | 2.699 |
| 0.4977368307922028 | 1.35 |
| 1.7488684153961014 | 0.675 |
| 0.8744342076980507 | 0.337 |
| 1.9372171038490253 | 0.169 |
| 1.4686085519245127 | 1.584 |
| 1.2343042759622564 | 2.292 |
| 2.1171521379811282 | 1.146 |
| 1.5585760689905641 | 2.073 |
| 1.279288034495282 | 2.537 |
| 0.639644017247641 | 1.268 |
| 0.3198220086238205 | 0.634 |
| 0.15991100431191024 | 0.317 |
| 1.579955502155955 | 0.159 |
| 1.2899777510779775 | 1.579 |
| 1.1449888755389888 | 2.29 |
| 0.5724944377694944 | 1.145 |
| 1.7862472188847471 | 0.572 |
| 2.3931236094423736 | 0.286 |
| 2.6965618047211866 | 0.143 |
| 2.8482809023605933 | 0.072 |
| 1.9241404511802966 | 1.536 |
| 0.9620702255901483 | 0.768 |
| 1.981035112795074 | 0.384 |
| 0.990517556397537 | 0.192 |
| 0.4952587781987685 | 0.096 |
| 0.24762938909938426 | 0.048 |
| 1.623814694549692 | 0.024 |
| 0.811907347274846 | 0.012 |
| 0.405953673637423 | 0.006 |
| 0.7029768368187115 | 1.503 |
| 0.35148841840935574 | 0.751 |
| 0.6757442092046779 | 1.876 |
| 0.33787210460233896 | 0.938 |
| 0.6689360523011695 | 1.969 |
| 1.8344680261505848 | 0.984 |
| 1.4172340130752925 | 1.992 |
| 2.2086170065376463 | 0.996 |
| 1.6043085032688231 | 1.998 |
| 0.8021542516344116 | 0.999 |
| 0.4010771258172058 | 0.5 |
| 1.700538562908603 | 0.25 |
| 0.8502692814543015 | 0.125 |